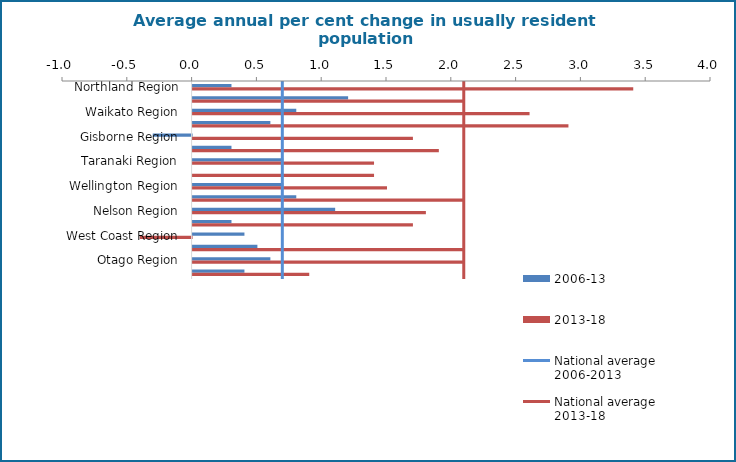
| Category | 2006-13 | 2013-18 |
|---|---|---|
| Northland Region | 0.3 | 3.4 |
| Auckland Region | 1.2 | 2.1 |
| Waikato Region | 0.8 | 2.6 |
| Bay of Plenty Region | 0.6 | 2.9 |
| Gisborne Region | -0.3 | 1.7 |
| Hawke's Bay Region | 0.3 | 1.9 |
| Taranaki Region | 0.7 | 1.4 |
| Manawatu-Wanganui Region | 0 | 1.4 |
| Wellington Region | 0.7 | 1.5 |
| Tasman Region | 0.8 | 2.1 |
| Nelson Region | 1.1 | 1.8 |
| Marlborough Region | 0.3 | 1.7 |
| West Coast Region | 0.4 | -0.4 |
| Canterbury Region | 0.5 | 2.1 |
| Otago Region | 0.6 | 2.1 |
| Southland Region | 0.4 | 0.9 |